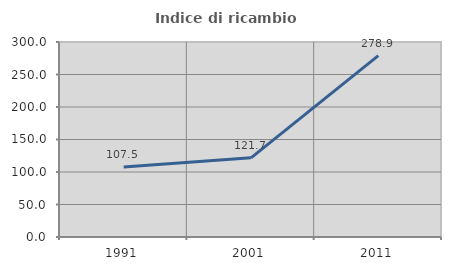
| Category | Indice di ricambio occupazionale  |
|---|---|
| 1991.0 | 107.539 |
| 2001.0 | 121.747 |
| 2011.0 | 278.947 |